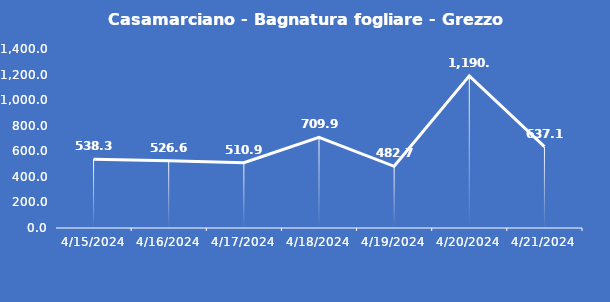
| Category | Casamarciano - Bagnatura fogliare - Grezzo (min) |
|---|---|
| 4/15/24 | 538.3 |
| 4/16/24 | 526.6 |
| 4/17/24 | 510.9 |
| 4/18/24 | 709.9 |
| 4/19/24 | 482.7 |
| 4/20/24 | 1190.3 |
| 4/21/24 | 637.1 |